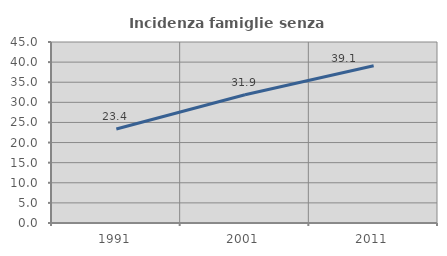
| Category | Incidenza famiglie senza nuclei |
|---|---|
| 1991.0 | 23.382 |
| 2001.0 | 31.886 |
| 2011.0 | 39.095 |